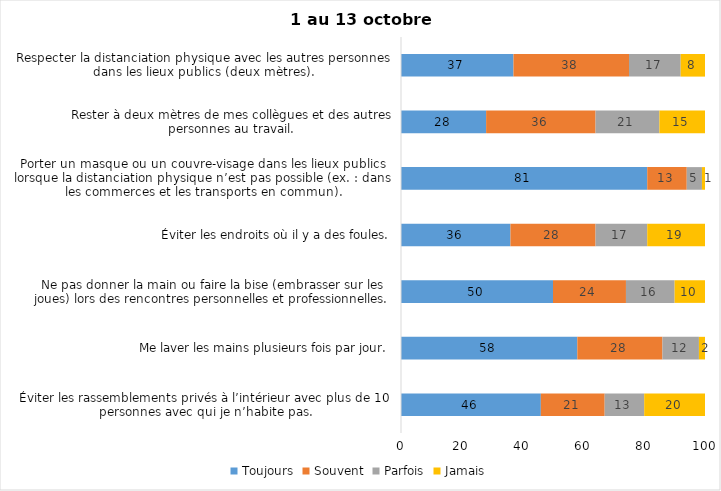
| Category | Toujours | Souvent | Parfois | Jamais |
|---|---|---|---|---|
| Éviter les rassemblements privés à l’intérieur avec plus de 10 personnes avec qui je n’habite pas. | 46 | 21 | 13 | 20 |
| Me laver les mains plusieurs fois par jour. | 58 | 28 | 12 | 2 |
| Ne pas donner la main ou faire la bise (embrasser sur les joues) lors des rencontres personnelles et professionnelles. | 50 | 24 | 16 | 10 |
| Éviter les endroits où il y a des foules. | 36 | 28 | 17 | 19 |
| Porter un masque ou un couvre-visage dans les lieux publics lorsque la distanciation physique n’est pas possible (ex. : dans les commerces et les transports en commun). | 81 | 13 | 5 | 1 |
| Rester à deux mètres de mes collègues et des autres personnes au travail. | 28 | 36 | 21 | 15 |
| Respecter la distanciation physique avec les autres personnes dans les lieux publics (deux mètres). | 37 | 38 | 17 | 8 |